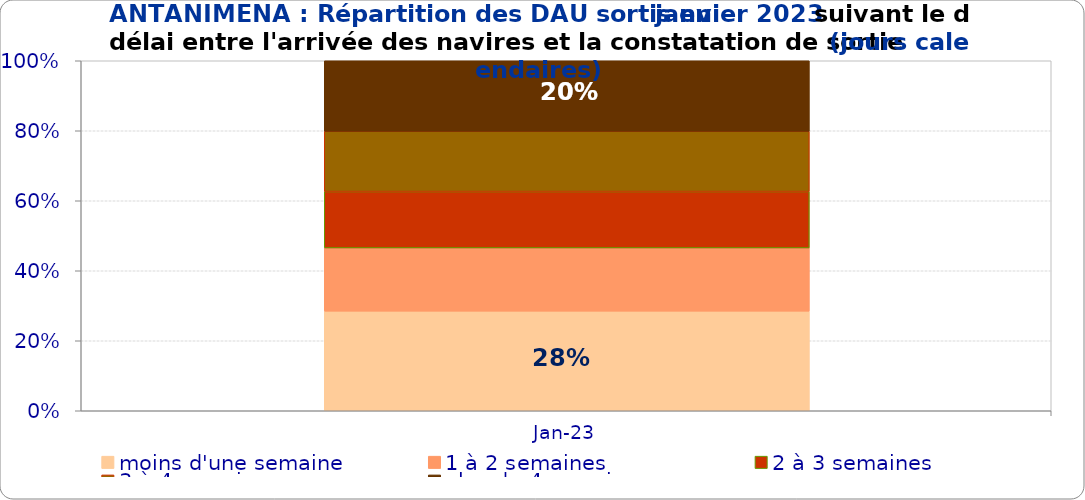
| Category | moins d'une semaine | 1 à 2 semaines | 2 à 3 semaines | 3 à 4 semaines | plus de 4 semaines |
|---|---|---|---|---|---|
| 2023-01-01 | 0.285 | 0.181 | 0.161 | 0.172 | 0.201 |